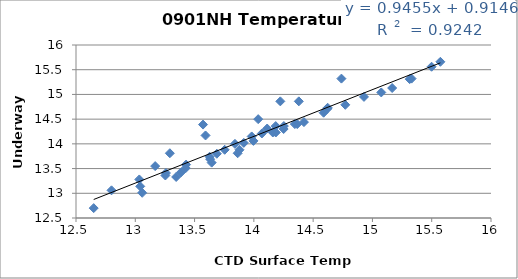
| Category | Temp |
|---|---|
| 14.2512 | 14.3 |
| 13.8405 | 14 |
| 14.36575 | 14.4 |
| 14.62035 | 14.71 |
| 13.627199999999998 | 13.74 |
| 14.159949999999998 | 14.23 |
| 14.4223 | 14.44 |
| 14.34565 | 14.4 |
| 13.915299999999998 | 14.02 |
| 15.330300000000001 | 15.32 |
| 15.49895 | 15.56 |
| 14.771149999999999 | 14.79 |
| 14.622399999999999 | 14.73 |
| 14.738399999999999 | 15.32 |
| 14.06765 | 14.21 |
| 13.42825 | 13.58 |
| 14.2233 | 14.86 |
| 14.3792 | 14.86 |
| 14.0365 | 14.5 |
| 14.5883 | 14.63 |
| 13.754 | 13.88 |
| 13.87885 | 13.88 |
| 13.59245 | 14.17 |
| 13.2587 | 13.41 |
| 13.0339 | 13.28 |
| 13.16765 | 13.55 |
| 15.1664 | 15.13 |
| 14.184899999999999 | 14.23 |
| 15.57295 | 15.66 |
| 14.18435 | 14.36 |
| 13.6312 | 13.69 |
| 13.2537 | 13.36 |
| 13.98175 | 14.15 |
| 13.8635 | 13.81 |
| 13.058250000000001 | 13.01 |
| 12.79955 | 13.06 |
| 13.687750000000001 | 13.8 |
| 13.64415 | 13.62 |
| 13.344899999999999 | 13.33 |
| 13.571449999999999 | 14.39 |
| 13.04165 | 13.14 |
| 14.112449999999999 | 14.31 |
| 14.9287 | 14.95 |
| 14.25295 | 14.36 |
| 13.996400000000001 | 14.06 |
| 15.314 | 15.31 |
| 15.0746 | 15.04 |
| 12.6493 | 12.7 |
| 13.2914 | 13.81 |
| 13.42535 | 13.51 |
| 13.3842 | 13.42 |